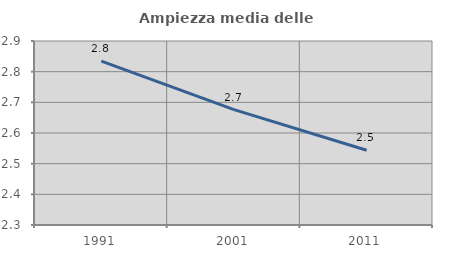
| Category | Ampiezza media delle famiglie |
|---|---|
| 1991.0 | 2.834 |
| 2001.0 | 2.676 |
| 2011.0 | 2.544 |